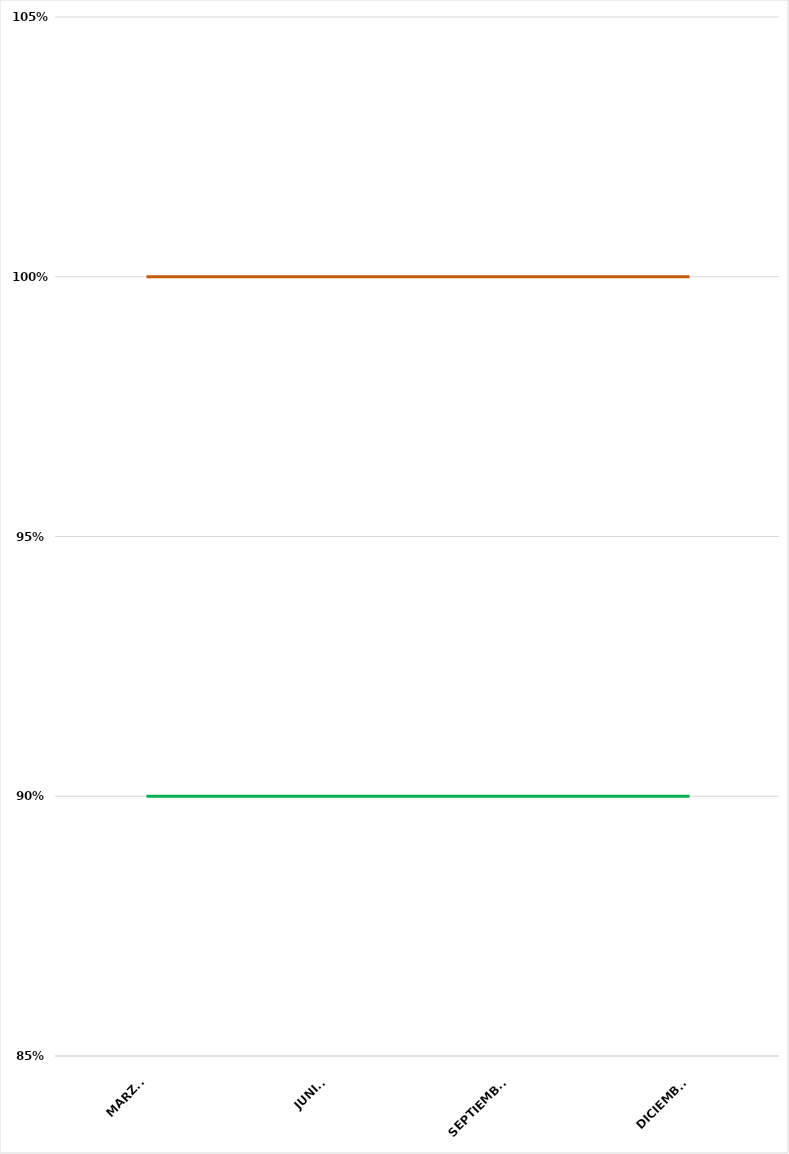
| Category | VALOR  | META PONDERADA |
|---|---|---|
| MARZO | 1 | 0.9 |
| JUNIO | 1 | 0.9 |
| SEPTIEMBRE | 1 | 0.9 |
| DICIEMBRE | 1 | 0.9 |